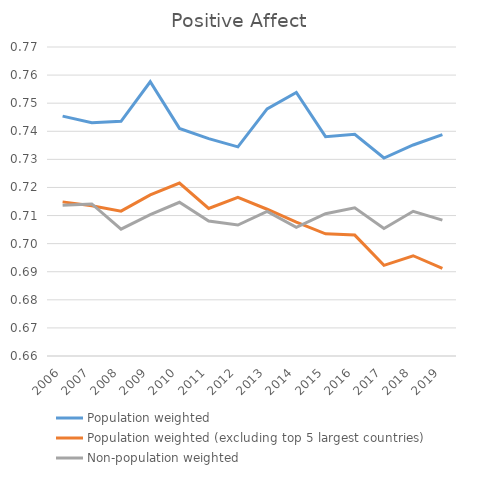
| Category | Population weighted | Population weighted (excluding top 5 largest countries) | Non-population weighted |
|---|---|---|---|
| 2006.0 | 0.745 | 0.715 | 0.714 |
| 2007.0 | 0.743 | 0.713 | 0.714 |
| 2008.0 | 0.744 | 0.712 | 0.705 |
| 2009.0 | 0.758 | 0.717 | 0.71 |
| 2010.0 | 0.741 | 0.722 | 0.715 |
| 2011.0 | 0.737 | 0.713 | 0.708 |
| 2012.0 | 0.734 | 0.717 | 0.707 |
| 2013.0 | 0.748 | 0.712 | 0.711 |
| 2014.0 | 0.754 | 0.708 | 0.706 |
| 2015.0 | 0.738 | 0.704 | 0.711 |
| 2016.0 | 0.739 | 0.703 | 0.713 |
| 2017.0 | 0.73 | 0.692 | 0.705 |
| 2018.0 | 0.735 | 0.696 | 0.712 |
| 2019.0 | 0.739 | 0.691 | 0.708 |